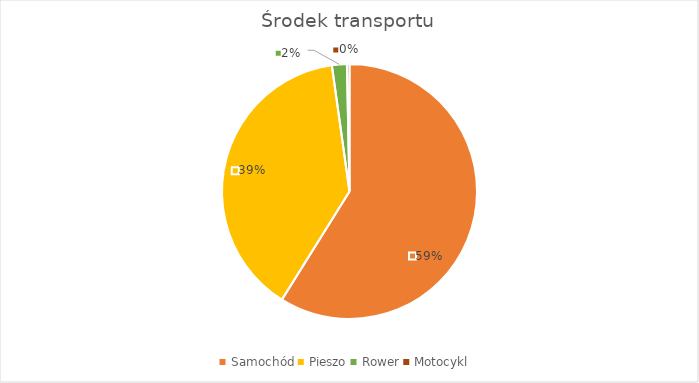
| Category | Series 0 |
|---|---|
| Samochód | 904 |
| Pieszo | 597 |
| Rower | 29 |
| Motocykl | 5 |